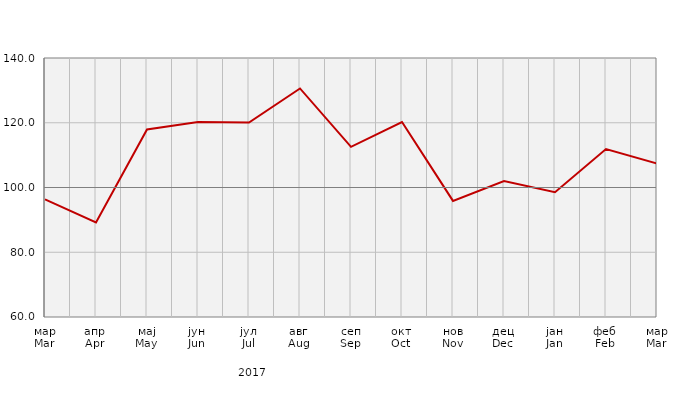
| Category | Индекси ноћења туриста
Tourist night indices |
|---|---|
| мар
Mar | 96.311 |
| апр
Apr | 89.193 |
| мај
May | 117.906 |
| јун
Jun | 120.259 |
| јул
Jul | 120.08 |
| авг
Aug | 130.596 |
| сеп
Sep | 112.544 |
| окт
Oct | 120.238 |
| нов
Nov | 95.857 |
| дец
Dec | 101.993 |
| јан
Jan | 98.549 |
| феб
Feb | 111.894 |
| мар
Mar | 107.417 |